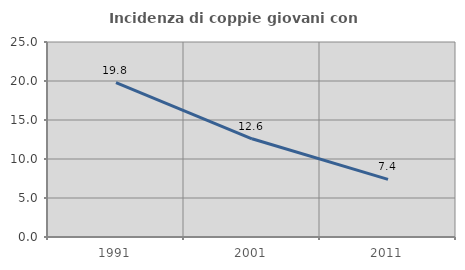
| Category | Incidenza di coppie giovani con figli |
|---|---|
| 1991.0 | 19.783 |
| 2001.0 | 12.589 |
| 2011.0 | 7.39 |